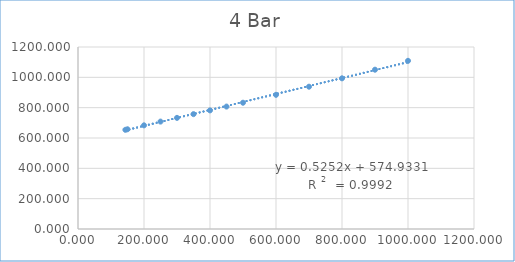
| Category | Series 0 |
|---|---|
| 143.6 | 654.109 |
| 150.0 | 657.621 |
| 200.0 | 683.445 |
| 250.0 | 708.194 |
| 300.0 | 732.704 |
| 350.0 | 757.286 |
| 400.0 | 782.107 |
| 450.0 | 807.215 |
| 500.0 | 832.656 |
| 600.0 | 884.663 |
| 700.0 | 938.27 |
| 800.0 | 993.502 |
| 900.0 | 1050.382 |
| 1000.0 | 1108.863 |